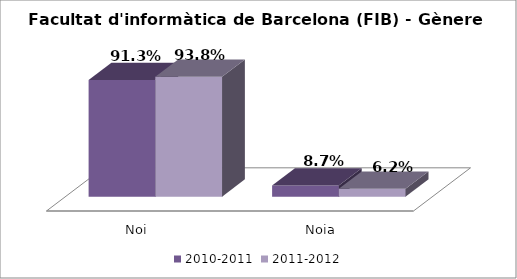
| Category | 2010-2011 | 2011-2012 |
|---|---|---|
| Noi | 0.913 | 0.938 |
| Noia | 0.087 | 0.062 |